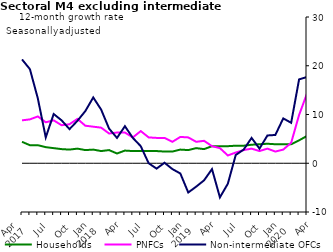
| Category | zero | Households | PNFCs | Non-intermediate OFCs |
|---|---|---|---|---|
| Apr 
2017 | 0 | 4.4 | 8.8 | 21.3 |
|  | 0 | 3.7 | 9 | 19.3 |
|  | 0 | 3.7 | 9.6 | 13.3 |
| Jul | 0 | 3.3 | 8.4 | 5.3 |
|  | 0 | 3.1 | 8.8 | 10.1 |
|  | 0 | 2.9 | 7.8 | 8.8 |
| Oct | 0 | 2.8 | 8 | 7 |
|  | 0 | 3 | 9.1 | 8.7 |
|  | 0 | 2.7 | 7.7 | 10.7 |
| Jan 
2018 | 0 | 2.8 | 7.5 | 13.5 |
|  | 0 | 2.5 | 7.3 | 11 |
|  | 0 | 2.7 | 6.1 | 7.1 |
| Apr | 0 | 2 | 6.3 | 5.2 |
|  | 0 | 2.6 | 6.3 | 7.6 |
|  | 0 | 2.5 | 5.3 | 5.2 |
| Jul | 0 | 2.5 | 6.6 | 3.5 |
|  | 0 | 2.5 | 5.3 | 0 |
|  | 0 | 2.5 | 5.2 | -1.1 |
| Oct | 0 | 2.4 | 5.2 | 0.1 |
|  | 0 | 2.4 | 4.4 | -1.2 |
|  | 0 | 2.8 | 5.4 | -2.1 |
| Jan 
2019 | 0 | 2.7 | 5.3 | -6 |
|  | 0 | 3.1 | 4.4 | -4.8 |
|  | 0 | 2.9 | 4.6 | -3.5 |
| Apr | 0 | 3.5 | 3.5 | -1.2 |
|  | 0 | 3.5 | 3.1 | -7 |
|  | 0 | 3.5 | 1.6 | -4.2 |
| Jul | 0 | 3.6 | 2.2 | 1.7 |
|  | 0 | 3.6 | 2.7 | 2.8 |
|  | 0 | 3.8 | 3 | 5.2 |
| Oct | 0 | 3.9 | 2.5 | 3 |
|  | 0 | 4 | 3 | 5.7 |
|  | 0 | 3.9 | 2.4 | 5.8 |
| Jan 
2020 | 0 | 3.9 | 2.8 | 9.2 |
|  | 0 | 3.9 | 4.2 | 8.3 |
|  | 0 | 4.7 | 9.9 | 17.2 |
| Apr | 0 | 5.6 | 14.3 | 17.7 |